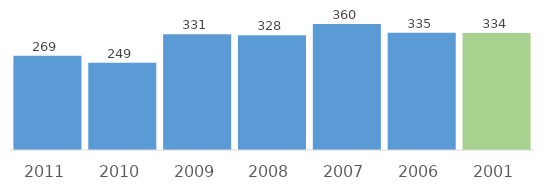
| Category | Series 0 |
|---|---|
| 2011.0 | 269 |
| 2010.0 | 249 |
| 2009.0 | 331 |
| 2008.0 | 328 |
| 2007.0 | 360 |
| 2006.0 | 335 |
| 2001.0 | 334 |